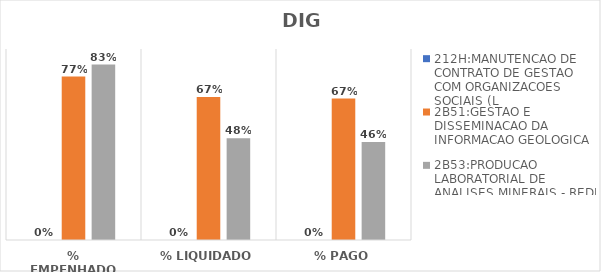
| Category | 212H:MANUTENCAO DE CONTRATO DE GESTAO COM ORGANIZACOES SOCIAIS (L | 2B51:GESTAO E DISSEMINACAO DA INFORMACAO GEOLOGICA | 2B53:PRODUCAO LABORATORIAL DE ANALISES MINERAIS - REDE LAMIN |
|---|---|---|---|
| % EMPENHADO | 0 | 0.77 | 0.826 |
| % LIQUIDADO | 0 | 0.673 | 0.479 |
| % PAGO | 0 | 0.667 | 0.461 |